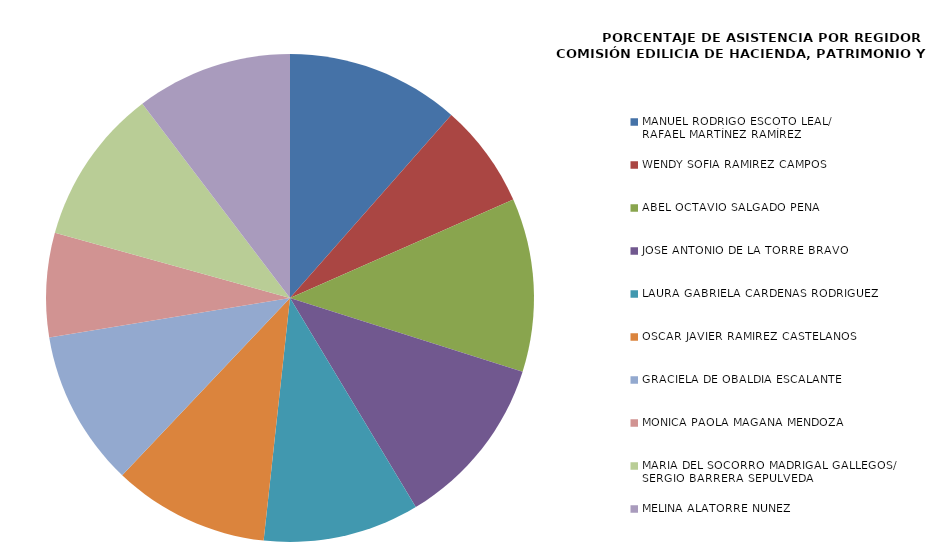
| Category | Series 0 |
|---|---|
| MANUEL RODRIGO ESCOTO LEAL/
RAFAEL MARTÍNEZ RAMÍREZ | 100 |
| WENDY SOFIA RAMÍREZ CAMPOS | 60 |
| ABEL OCTAVIO SALGADO PEÑA  | 100 |
| JOSÉ ANTONIO DE LA TORRE BRAVO | 100 |
| LAURA GABRIELA CARDENAS RODRIGUEZ | 90 |
| OSCAR JAVIER RAMÍREZ CASTELANOS | 90 |
| GRACIELA DE OBALDÍA ESCALANTE | 90 |
| MÓNICA PAOLA MAGAÑA MENDOZA | 60 |
| MARÍA DEL SOCORRO MADRIGAL GALLEGOS/
SERGIO BARRERA SEPULVEDA | 90 |
| MELINA ALATORRE NÚÑEZ | 90 |